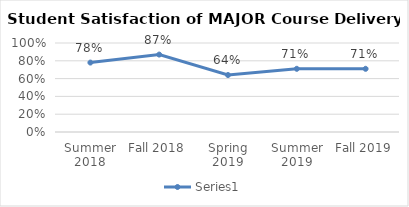
| Category | Series 0 |
|---|---|
| Summer 2018 | 0.78 |
| Fall 2018 | 0.87 |
| Spring 2019 | 0.64 |
| Summer 2019 | 0.71 |
| Fall 2019 | 0.71 |